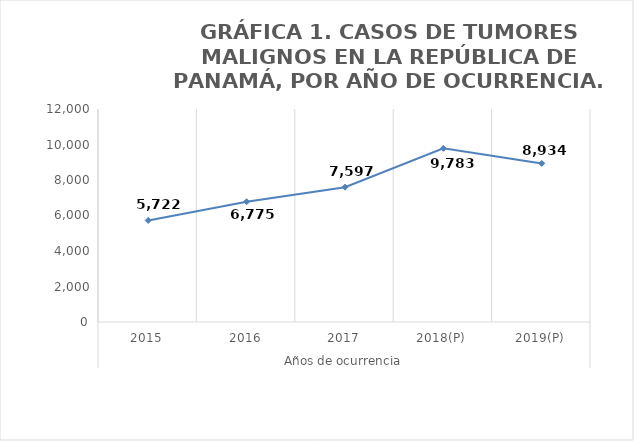
| Category | Total |
|---|---|
| 0 | 5722 |
| 1 | 6775 |
| 2 | 7597 |
| 3 | 9783 |
| 4 | 8934 |